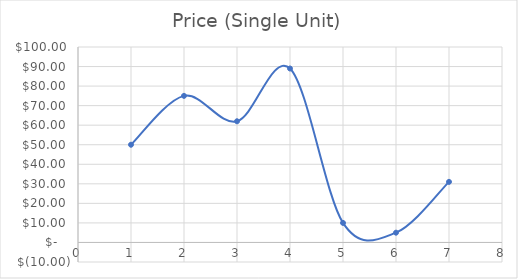
| Category | Price (Single Unit) |
|---|---|
| 1.0 | 50 |
| 2.0 | 75 |
| 3.0 | 62 |
| 4.0 | 89 |
| 5.0 | 10 |
| 6.0 | 5 |
| 7.0 | 31 |